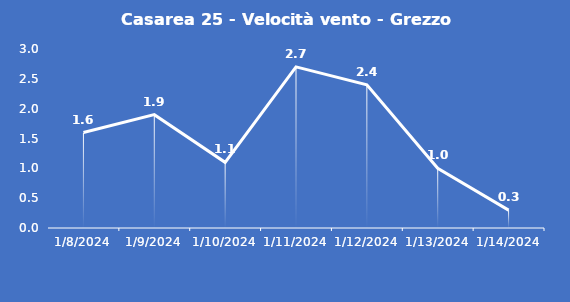
| Category | Casarea 25 - Velocità vento - Grezzo (m/s) |
|---|---|
| 1/8/24 | 1.6 |
| 1/9/24 | 1.9 |
| 1/10/24 | 1.1 |
| 1/11/24 | 2.7 |
| 1/12/24 | 2.4 |
| 1/13/24 | 1 |
| 1/14/24 | 0.3 |